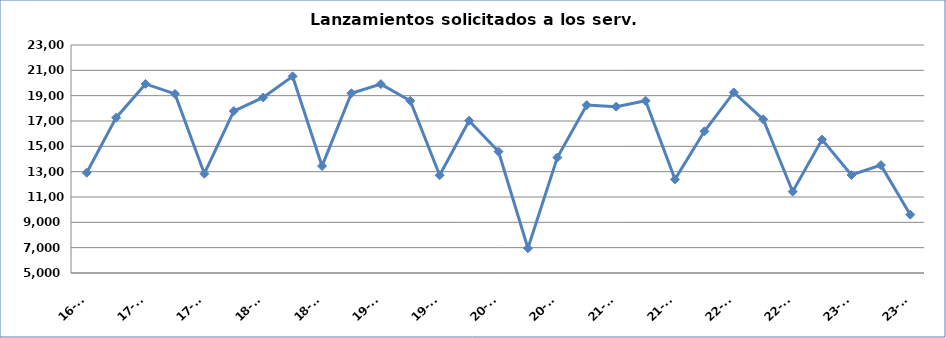
| Category | Series 0 |
|---|---|
| 16-T3 | 12918 |
| 16-T4 | 17265 |
| 17-T1 | 19926 |
| 17-T2 | 19141 |
| 17-T3 | 12840 |
| 17-T4 | 17786 |
| 18-T1 | 18859 |
| 18-T2 | 20526 |
| 18-T3 | 13446 |
| 18-T4 | 19192 |
| 19-T1 | 19913 |
| 19-T2 | 18594 |
| 19-T3 | 12715 |
| 19-T4 | 17025 |
| 20-T1 | 14586 |
| 20-T2 | 6953 |
| 20-T3 | 14117 |
| 20-T4 | 18255 |
| 21-T1 | 18131 |
| 21-T2 | 18598 |
| 21-T3 | 12390 |
| 21-T4 | 16187 |
| 22-T1 | 19257 |
| 22-T2 | 17134 |
| 22-T3 | 11425 |
| 22-T4 | 15536 |
| 23-T1 | 12736 |
| 23-T2 | 13516 |
| 23-T3 | 9605 |